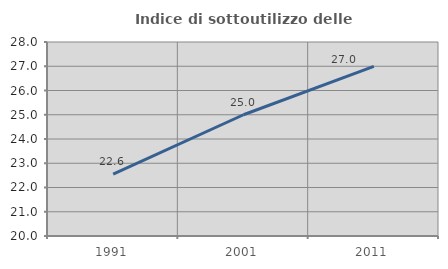
| Category | Indice di sottoutilizzo delle abitazioni  |
|---|---|
| 1991.0 | 22.551 |
| 2001.0 | 25 |
| 2011.0 | 26.993 |